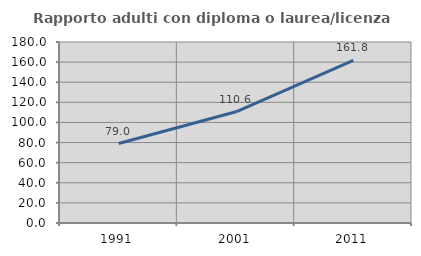
| Category | Rapporto adulti con diploma o laurea/licenza media  |
|---|---|
| 1991.0 | 79.032 |
| 2001.0 | 110.606 |
| 2011.0 | 161.765 |